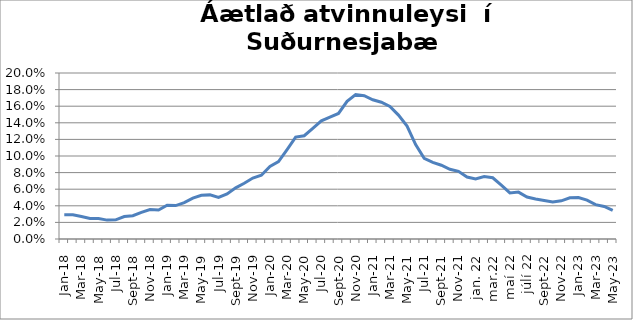
| Category | Series 0 |
|---|---|
| Jan-18 | 0.029 |
| Feb-18 | 0.029 |
| Mar-18 | 0.027 |
| Apr-18 | 0.025 |
| May-18 | 0.025 |
| Jun-18 | 0.023 |
| Jul-18 | 0.023 |
| Aug-18 | 0.027 |
| Sep-18 | 0.028 |
| Oct-18 | 0.032 |
| Nov-18 | 0.036 |
| Dec-18 | 0.035 |
| Jan-19 | 0.041 |
| Feb-19 | 0.04 |
| Mar-19 | 0.044 |
| Apr-19 | 0.049 |
| May-19 | 0.053 |
| Jun-19 | 0.053 |
| Jul-19 | 0.05 |
| Aug-19 | 0.054 |
| Sep-19 | 0.062 |
| Oct-19 | 0.067 |
| Nov-19 | 0.073 |
| Dec-19 | 0.077 |
| Jan-20 | 0.087 |
| Feb-20 | 0.093 |
| Mar-20 | 0.108 |
| Apr-20 | 0.123 |
| May-20 | 0.124 |
| Jun-20 | 0.133 |
| Jul-20 | 0.142 |
| Aug-20 | 0.147 |
| Sep-20 | 0.151 |
| Oct-20 | 0.166 |
| Nov-20 | 0.174 |
| Dec-20 | 0.173 |
| Jan-21 | 0.168 |
| Feb-21 | 0.165 |
| Mar-21 | 0.16 |
| Apr-21 | 0.149 |
| May-21 | 0.136 |
| Jun-21 | 0.114 |
| Jul-21 | 0.097 |
| Aug-21 | 0.092 |
| Sep-21 | 0.089 |
| Oct-21 | 0.084 |
| Nov-21 | 0.082 |
| Dec-21 | 0.075 |
| jan. 22 | 0.072 |
| feb.22 | 0.075 |
| mar.22 | 0.074 |
| apr.22 | 0.065 |
| maí 22 | 0.056 |
| júní 22 | 0.056 |
| júlí 22 | 0.051 |
| ágúst 22 | 0.048 |
| Sep-22 | 0.046 |
| Oct-22 | 0.045 |
| Nov-22 | 0.046 |
| Dec-22 | 0.05 |
| Jan-23 | 0.05 |
| Feb-23 | 0.047 |
| Mar-23 | 0.041 |
| Apr-23 | 0.039 |
| May-23 | 0.034 |